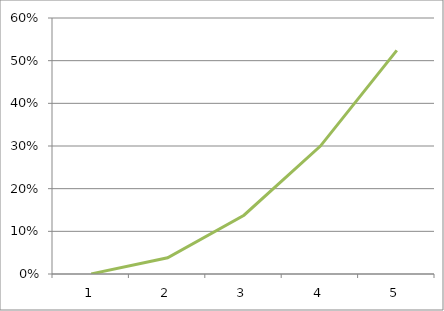
| Category | Series 2 |
|---|---|
| 0 | 0 |
| 1 | 0.038 |
| 2 | 0.138 |
| 3 | 0.3 |
| 4 | 0.524 |